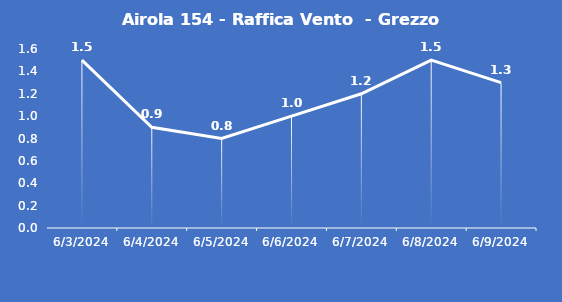
| Category | Airola 154 - Raffica Vento  - Grezzo (m/s) |
|---|---|
| 6/3/24 | 1.5 |
| 6/4/24 | 0.9 |
| 6/5/24 | 0.8 |
| 6/6/24 | 1 |
| 6/7/24 | 1.2 |
| 6/8/24 | 1.5 |
| 6/9/24 | 1.3 |